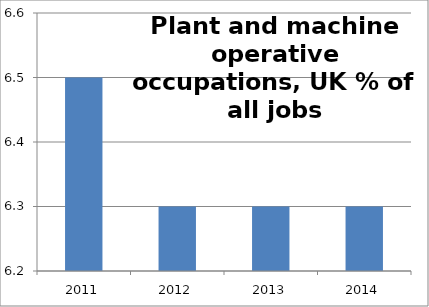
| Category | 8: Plant & machine operatives |
|---|---|
| 2011.0 | 6.5 |
| 2012.0 | 6.3 |
| 2013.0 | 6.3 |
| 2014.0 | 6.3 |